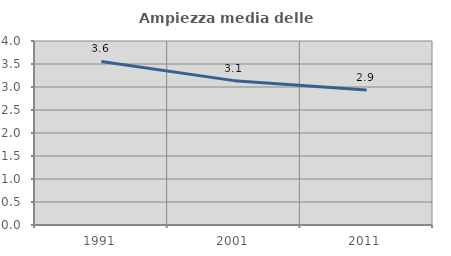
| Category | Ampiezza media delle famiglie |
|---|---|
| 1991.0 | 3.556 |
| 2001.0 | 3.138 |
| 2011.0 | 2.936 |